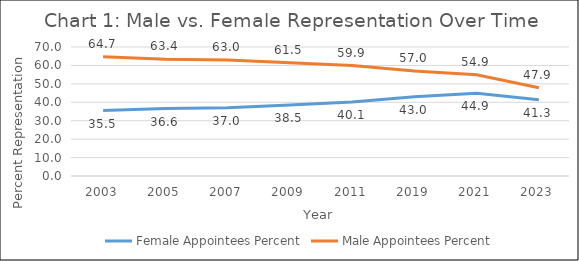
| Category | Female Appointees Percent | Male Appointees Percent |
|---|---|---|
| 2003.0 | 35.5 | 64.7 |
| 2005.0 | 36.6 | 63.4 |
| 2007.0 | 37 | 63 |
| 2009.0 | 38.5 | 61.5 |
| 2011.0 | 40.1 | 59.9 |
| 2019.0 | 43 | 57 |
| 2021.0 | 44.9 | 54.9 |
| 2023.0 | 41.344 | 47.868 |